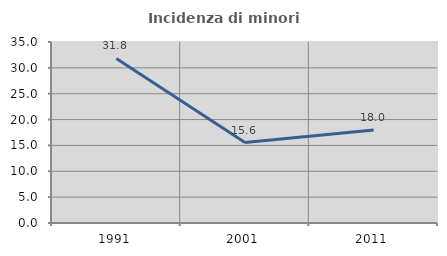
| Category | Incidenza di minori stranieri |
|---|---|
| 1991.0 | 31.818 |
| 2001.0 | 15.556 |
| 2011.0 | 18 |